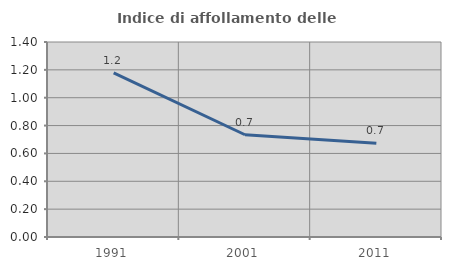
| Category | Indice di affollamento delle abitazioni  |
|---|---|
| 1991.0 | 1.178 |
| 2001.0 | 0.734 |
| 2011.0 | 0.672 |